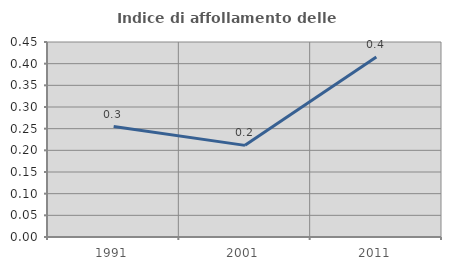
| Category | Indice di affollamento delle abitazioni  |
|---|---|
| 1991.0 | 0.255 |
| 2001.0 | 0.211 |
| 2011.0 | 0.416 |